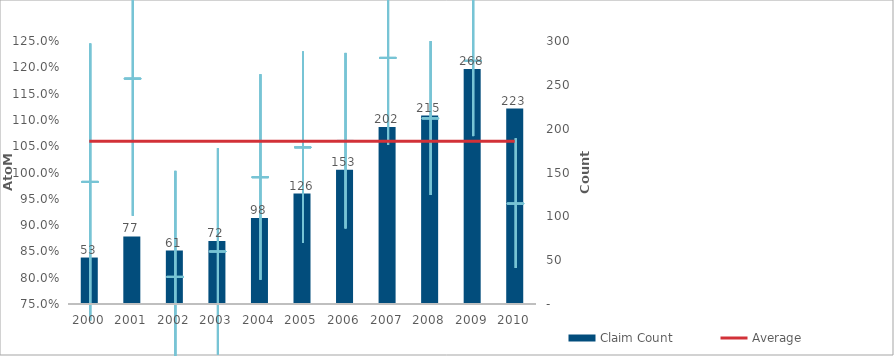
| Category | Claim Count |
|---|---|
| 0 | 53 |
| 1 | 77 |
| 2 | 61 |
| 3 | 72 |
| 4 | 98 |
| 5 | 126 |
| 6 | 153 |
| 7 | 202 |
| 8 | 215 |
| 9 | 268 |
| 10 | 223 |